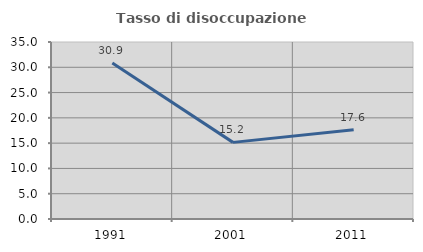
| Category | Tasso di disoccupazione giovanile  |
|---|---|
| 1991.0 | 30.864 |
| 2001.0 | 15.152 |
| 2011.0 | 17.647 |